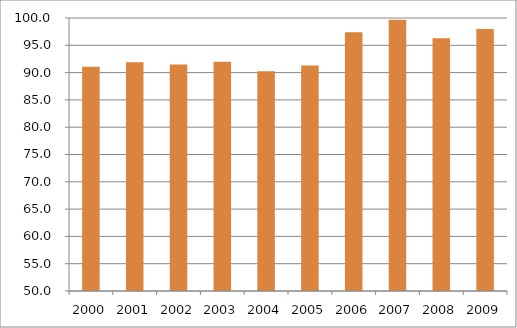
| Category | Brasil |
|---|---|
| 2000.0 | 91.08 |
| 2001.0 | 91.88 |
| 2002.0 | 91.47 |
| 2003.0 | 92 |
| 2004.0 | 90.27 |
| 2005.0 | 91.31 |
| 2006.0 | 97.38 |
| 2007.0 | 99.69 |
| 2008.0 | 96.27 |
| 2009.0 | 98 |